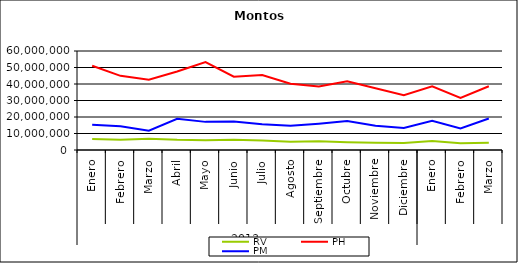
| Category | RV | PH | PM |
|---|---|---|---|
| 0 | 6603412.357 | 51097257.501 | 15291994.497 |
| 1 | 6144371.716 | 44938482.89 | 14418861.164 |
| 2 | 6870539.137 | 42574717.992 | 11735480.075 |
| 3 | 6139858.354 | 47535968.024 | 18924825.739 |
| 4 | 5890476.617 | 53273527.932 | 17047621.863 |
| 5 | 6142686.449 | 44450017.2 | 17254269.094 |
| 6 | 5792277.798 | 45481930.674 | 15546714.502 |
| 7 | 4962192.427 | 40196203.529 | 14644148.591 |
| 8 | 5244267.415 | 38549056.812 | 15946518.356 |
| 9 | 4723321.466 | 41614732.22 | 17536811.707 |
| 10 | 4437368.656 | 37439358.84 | 14761398.421 |
| 11 | 4226608.984 | 33178083.97 | 13384599.022 |
| 12 | 5420667.417 | 38592535.269 | 17738595.757 |
| 13 | 4106438.771 | 31549668.118 | 13082413.394 |
| 14 | 4333641.03 | 38643419.598 | 19107804.717 |